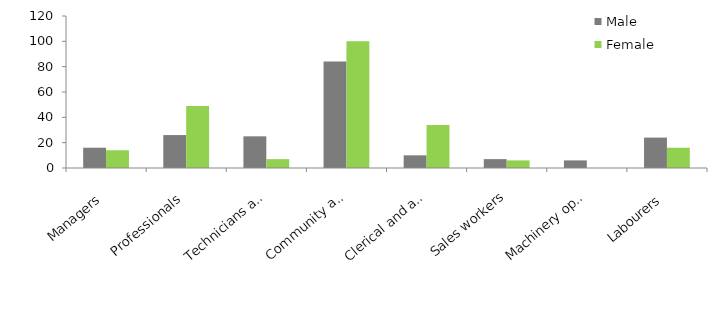
| Category | Male | Female |
|---|---|---|
| Managers | 16 | 14 |
| Professionals | 26 | 49 |
| Technicians and trades workers | 25 | 7 |
| Community and personal service workers | 84 | 100 |
| Clerical and administrative workers | 10 | 34 |
| Sales workers | 7 | 6 |
| Machinery operators and drivers | 6 | 0 |
| Labourers | 24 | 16 |